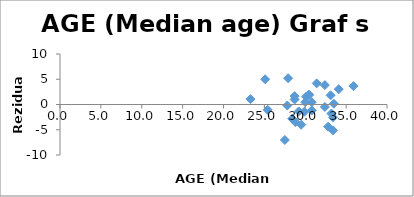
| Category | Series 0 |
|---|---|
| 33.5 | 0.161 |
| 32.8 | -4.386 |
| 33.4 | -2.537 |
| 27.8 | -0.198 |
| 27.9 | 5.209 |
| 33.2 | -1.789 |
| 30.8 | 0.475 |
| 32.4 | -0.482 |
| 29.2 | -1.373 |
| 28.7 | 0.995 |
| 25.1 | 4.997 |
| 35.9 | 3.635 |
| 31.4 | 4.186 |
| 30.1 | 1.541 |
| 34.1 | 3.03 |
| 30.5 | 1.931 |
| 30.0 | 0.471 |
| 32.4 | 3.84 |
| 28.7 | 1.658 |
| 33.4 | -5.128 |
| 29.9 | -1.427 |
| 23.3 | 1.069 |
| 27.5 | -7.025 |
| 29.5 | -4.008 |
| 25.4 | -1.058 |
| 28.8 | -3.499 |
| 33.1 | 1.815 |
| 30.8 | -1.179 |
| 28.4 | -2.817 |
| 30.4 | 1.895 |